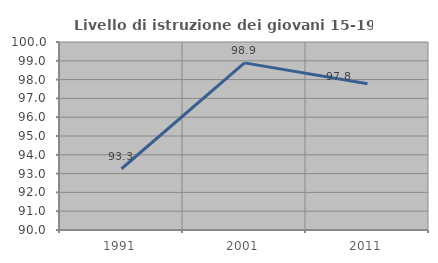
| Category | Livello di istruzione dei giovani 15-19 anni |
|---|---|
| 1991.0 | 93.258 |
| 2001.0 | 98.889 |
| 2011.0 | 97.778 |